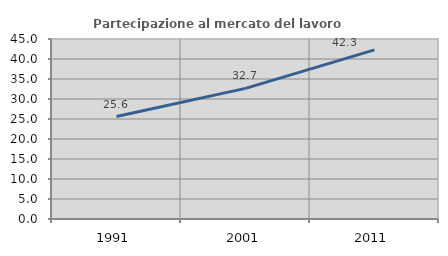
| Category | Partecipazione al mercato del lavoro  femminile |
|---|---|
| 1991.0 | 25.622 |
| 2001.0 | 32.664 |
| 2011.0 | 42.297 |